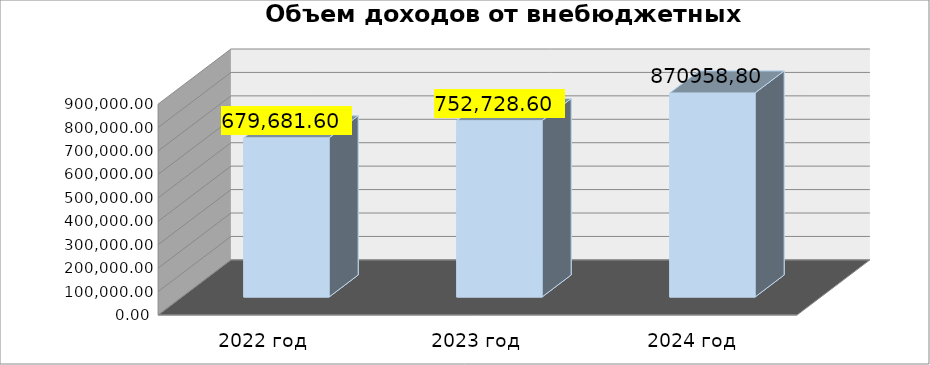
| Category | Series 0 |
|---|---|
| 2022 год | 679681.6 |
| 2023 год | 752728.6 |
|  2024 год | 870958.8 |